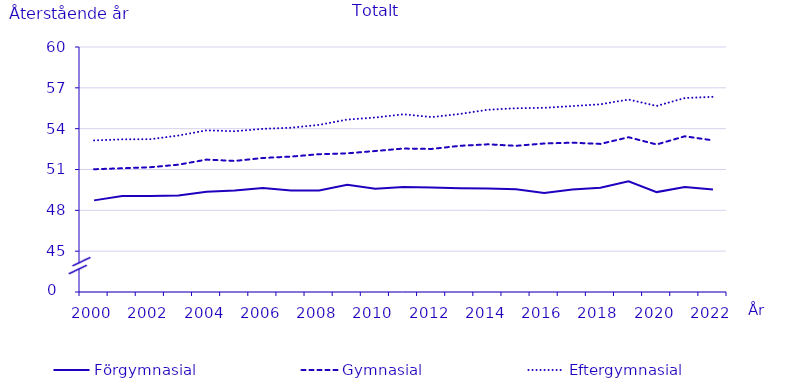
| Category | Förgymnasial | Gymnasial | Eftergymnasial |
|---|---|---|---|
| 2000.0 | 48.731 | 51.02 | 53.137 |
| 2001.0 | 49.05 | 51.09 | 53.215 |
| 2002.0 | 49.047 | 51.169 | 53.227 |
| 2003.0 | 49.095 | 51.354 | 53.494 |
| 2004.0 | 49.374 | 51.728 | 53.879 |
| 2005.0 | 49.45 | 51.628 | 53.812 |
| 2006.0 | 49.641 | 51.846 | 53.988 |
| 2007.0 | 49.465 | 51.948 | 54.069 |
| 2008.0 | 49.458 | 52.125 | 54.278 |
| 2009.0 | 49.886 | 52.189 | 54.669 |
| 2010.0 | 49.592 | 52.36 | 54.819 |
| 2011.0 | 49.723 | 52.538 | 55.057 |
| 2012.0 | 49.68 | 52.51 | 54.85 |
| 2013.0 | 49.63 | 52.74 | 55.08 |
| 2014.0 | 49.61 | 52.85 | 55.39 |
| 2015.0 | 49.54 | 52.74 | 55.5 |
| 2016.0 | 49.27 | 52.91 | 55.53 |
| 2017.0 | 49.53 | 52.97 | 55.66 |
| 2018.0 | 49.66 | 52.88 | 55.79 |
| 2019.0 | 50.14 | 53.37 | 56.14 |
| 2020.0 | 49.34 | 52.84 | 55.67 |
| 2021.0 | 49.72 | 53.44 | 56.25 |
| 2022.0 | 49.53 | 53.14 | 56.34 |